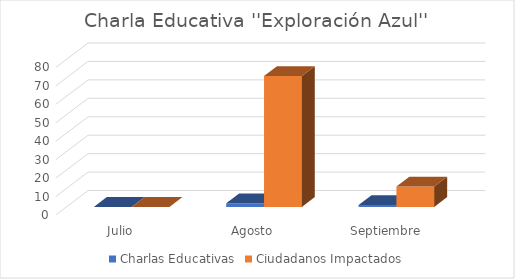
| Category | Charlas Educativas | Ciudadanos Impactados |
|---|---|---|
| Julio | 0 | 0 |
| Agosto | 2 | 71 |
| Septiembre | 1 | 11 |